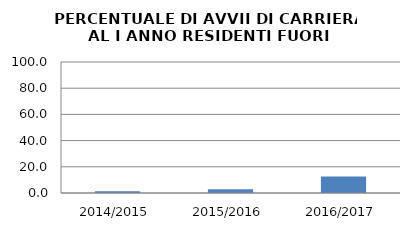
| Category | 2014/2015 2015/2016 2016/2017 |
|---|---|
| 2014/2015 | 1.37 |
| 2015/2016 | 2.817 |
| 2016/2017 | 12.676 |